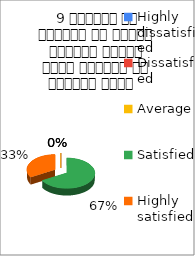
| Category |  9 शिक्षक ने शिक्षण के दौरान आधुनिक तकनीक पावर पॉइन्ट का प्रयोग किया   |
|---|---|
| Highly dissatisfied | 0 |
| Dissatisfied | 0 |
| Average | 0 |
| Satisfied | 4 |
| Highly satisfied | 2 |